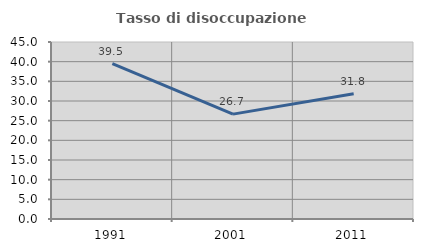
| Category | Tasso di disoccupazione giovanile  |
|---|---|
| 1991.0 | 39.474 |
| 2001.0 | 26.667 |
| 2011.0 | 31.818 |